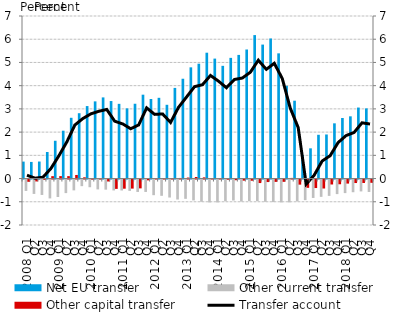
| Category | Net EU transfer | Other current transfer | Other capital transfer |
|---|---|---|---|
| 2008 Q1 | 0.73 | -0.49 | -0.097 |
| Q2 | 0.716 | -0.619 | -0.082 |
| Q3 | 0.733 | -0.663 | -0.013 |
| Q4 | 1.144 | -0.813 | 0.103 |
| 2009 Q1 | 1.628 | -0.75 | 0.105 |
| Q2 | 2.061 | -0.583 | 0.104 |
| Q3 | 2.617 | -0.466 | 0.155 |
| Q4 | 2.814 | -0.284 | 0.054 |
| 2010 Q1 | 3.122 | -0.331 | -0.006 |
| Q2 | 3.323 | -0.424 | -0.003 |
| Q3 | 3.495 | -0.435 | -0.083 |
| Q4 | 3.338 | -0.468 | -0.402 |
| 2011 Q1 | 3.217 | -0.471 | -0.393 |
| Q2 | 3.022 | -0.488 | -0.389 |
| Q3 | 3.221 | -0.533 | -0.38 |
| Q4 | 3.612 | -0.534 | -0.034 |
| 2012 Q1 | 3.426 | -0.673 | 0.011 |
| Q2 | 3.477 | -0.7 | 0.005 |
| Q3 | 3.176 | -0.774 | 0.014 |
| Q4 | 3.904 | -0.86 | 0.026 |
| 2013 Q1 | 4.298 | -0.83 | 0.043 |
| Q2 | 4.789 | -0.898 | 0.066 |
| Q3 | 4.947 | -0.956 | 0.051 |
| Q4 | 5.419 | -0.986 | 0.006 |
| 2014 Q1 | 5.166 | -0.985 | 0.016 |
| Q2 | 4.854 | -0.935 | -0.007 |
| Q3 | 5.197 | -0.902 | -0.028 |
| Q4 | 5.324 | -0.947 | -0.048 |
| 2015 Q1 | 5.557 | -0.928 | -0.051 |
| Q2 | 6.178 | -0.931 | -0.151 |
| Q3 | 5.77 | -0.958 | -0.108 |
| Q4 | 6.032 | -0.969 | -0.1 |
| 2016 Q1 | 5.392 | -0.985 | -0.098 |
| Q2 | 3.99 | -0.982 | 0.028 |
| Q3 | 3.353 | -0.941 | -0.219 |
| Q4 | 1.004 | -0.887 | -0.356 |
| 2017 Q1 | 1.302 | -0.793 | -0.366 |
| Q2 | 1.885 | -0.745 | -0.385 |
| Q3 | 1.898 | -0.704 | -0.212 |
| Q4 | 2.378 | -0.626 | -0.203 |
| 2018 Q1 | 2.608 | -0.584 | -0.173 |
| Q2 | 2.68 | -0.546 | -0.15 |
| Q3 | 3.058 | -0.511 | -0.147 |
| Q4 | 3.021 | -0.534 | -0.14 |